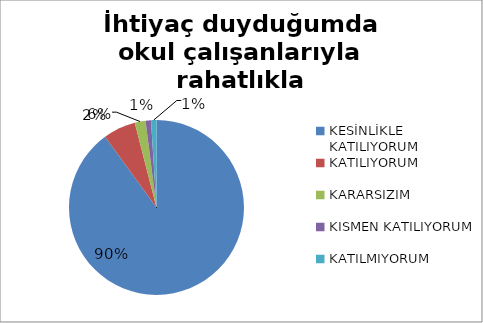
| Category | İhtiyaç duyduğumda okul çalışanlarıyla rahatlıkla görüşebiliyorum. |
|---|---|
| KESİNLİKLE KATILIYORUM | 180 |
| KATILIYORUM | 12 |
| KARARSIZIM | 4 |
| KISMEN KATILIYORUM | 2 |
| KATILMIYORUM | 2 |